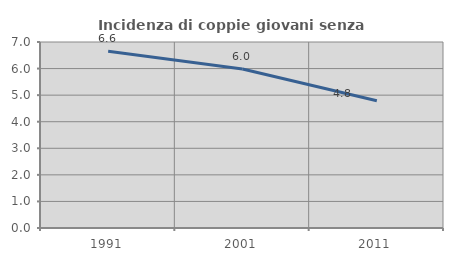
| Category | Incidenza di coppie giovani senza figli |
|---|---|
| 1991.0 | 6.649 |
| 2001.0 | 5.981 |
| 2011.0 | 4.789 |